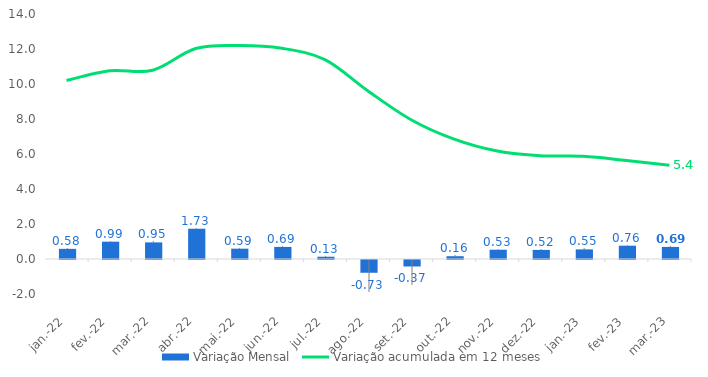
| Category | Variação Mensal |
|---|---|
| 2022-01-01 | 0.58 |
| 2022-02-01 | 0.99 |
| 2022-03-01 | 0.95 |
| 2022-04-01 | 1.73 |
| 2022-05-01 | 0.59 |
| 2022-06-01 | 0.69 |
| 2022-07-01 | 0.13 |
| 2022-08-01 | -0.73 |
| 2022-09-01 | -0.37 |
| 2022-10-01 | 0.16 |
| 2022-11-01 | 0.53 |
| 2022-12-01 | 0.52 |
| 2023-01-01 | 0.55 |
| 2023-02-01 | 0.76 |
| 2023-03-01 | 0.69 |